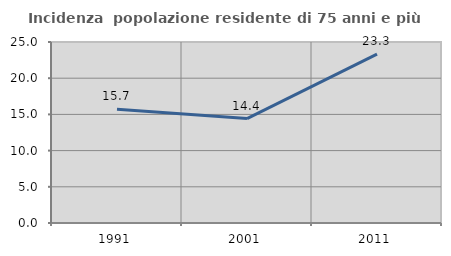
| Category | Incidenza  popolazione residente di 75 anni e più |
|---|---|
| 1991.0 | 15.714 |
| 2001.0 | 14.423 |
| 2011.0 | 23.333 |